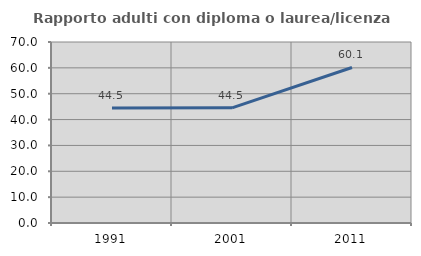
| Category | Rapporto adulti con diploma o laurea/licenza media  |
|---|---|
| 1991.0 | 44.492 |
| 2001.0 | 44.541 |
| 2011.0 | 60.146 |